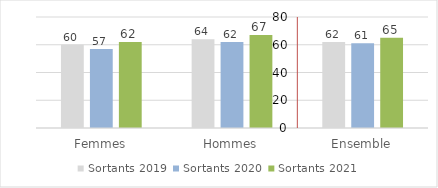
| Category | Sortants 2019 | Sortants 2020 | Sortants 2021 |
|---|---|---|---|
| Femmes | 60 | 57 | 62 |
| Hommes | 64 | 62 | 67 |
| Ensemble | 62 | 61 | 65 |